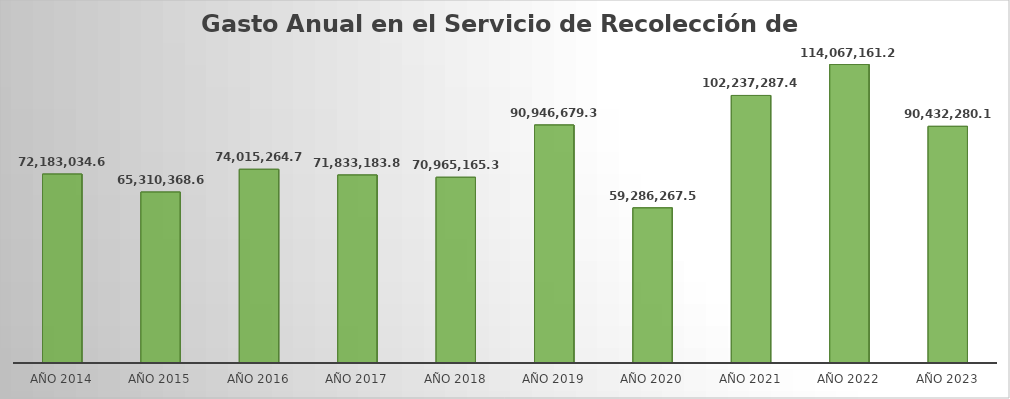
| Category | Monto |
|---|---|
| Año 2014 | 72183034.64 |
| Año 2015 | 65310368.69 |
| Año 2016 | 74015264.76 |
| Año 2017 | 71833183.89 |
| Año 2018 | 70965165.32 |
| Año 2019 | 90946679.38 |
| Año 2020 | 59286267.53 |
| Año 2021 | 102237287.49 |
| Año 2022 | 114067161.23 |
| Año 2023 | 90432280.16 |